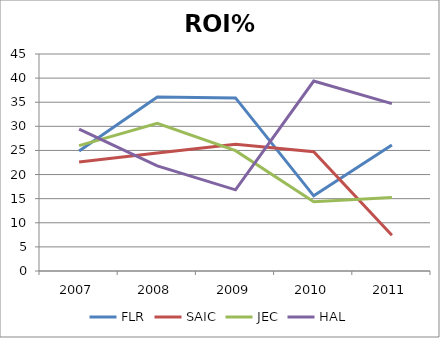
| Category | FLR | SAIC | JEC | HAL |
|---|---|---|---|---|
| 2007.0 | 24.89 | 22.6 | 26 | 29.41 |
| 2008.0 | 36.07 | 24.46 | 30.64 | 21.81 |
| 2009.0 | 35.89 | 26.28 | 24.96 | 16.83 |
| 2010.0 | 15.59 | 24.75 | 14.37 | 39.39 |
| 2011.0 | 26.14 | 7.43 | 15.26 | 34.7 |